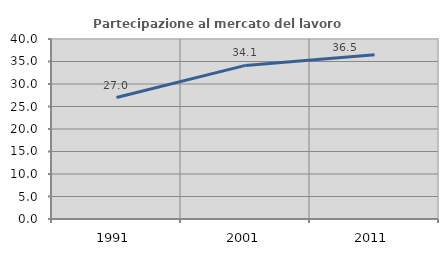
| Category | Partecipazione al mercato del lavoro  femminile |
|---|---|
| 1991.0 | 26.988 |
| 2001.0 | 34.134 |
| 2011.0 | 36.502 |